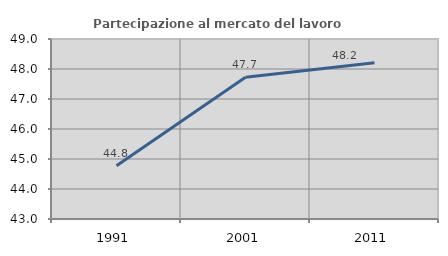
| Category | Partecipazione al mercato del lavoro  femminile |
|---|---|
| 1991.0 | 44.772 |
| 2001.0 | 47.727 |
| 2011.0 | 48.209 |